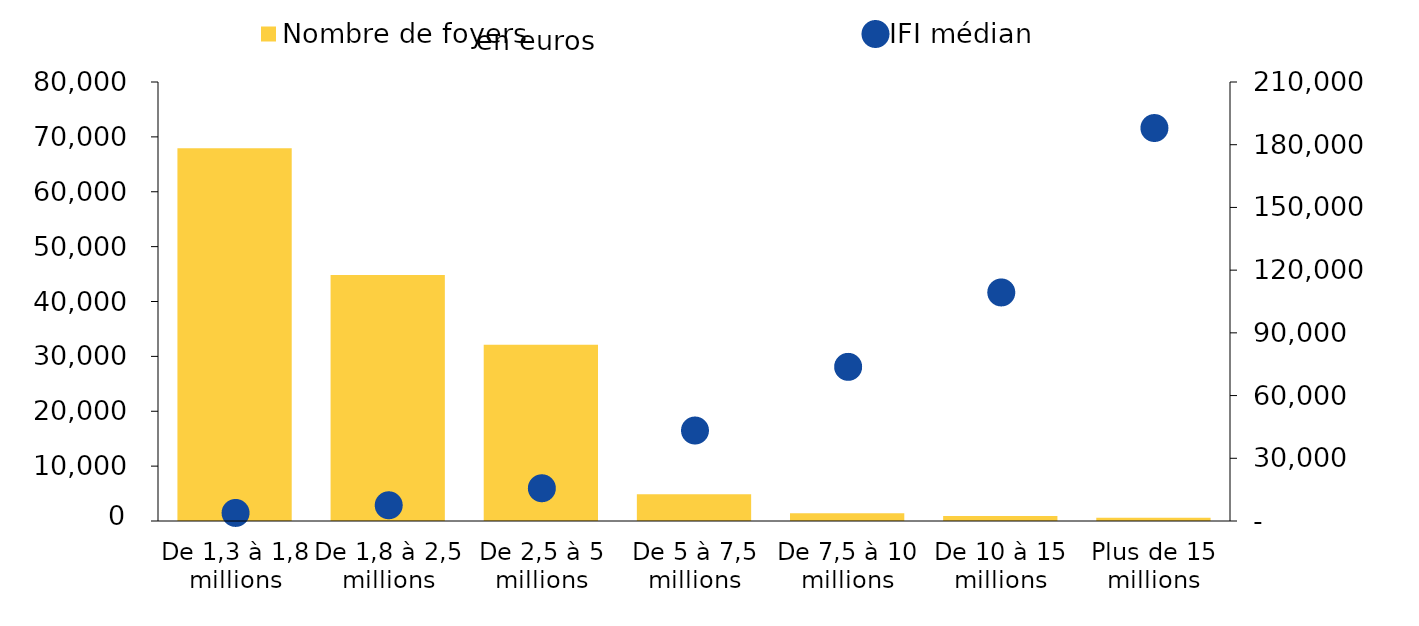
| Category | Nombre de foyers |
|---|---|
| De 1,3 à 1,8 millions | 67920 |
| De 1,8 à 2,5 millions | 44842 |
| De 2,5 à 5 millions | 32111 |
| De 5 à 7,5 millions | 4855 |
| De 7,5 à 10 millions | 1423 |
| De 10 à 15 millions | 931 |
| Plus de 15 millions | 609 |